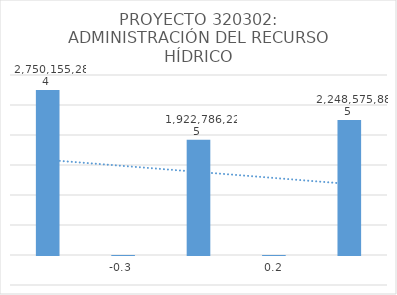
| Category | Series 0 |
|---|---|
| 0 | 2750155284 |
| 1 | -0.301 |
| 2 | 1922786224.508 |
| 3 | 0.169 |
| 4 | 2248575884.971 |